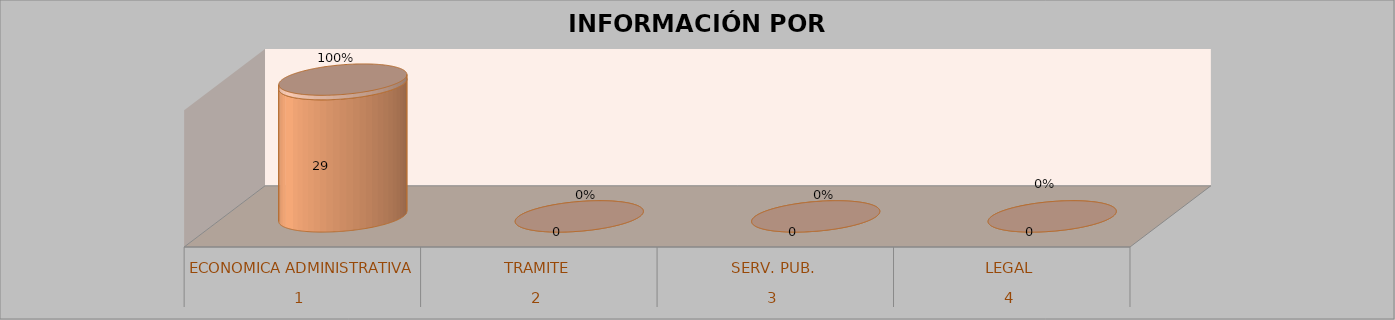
| Category | Series 0 | Series 1 | Series 2 | Series 3 |
|---|---|---|---|---|
| 0 |  |  | 29 | 1 |
| 1 |  |  | 0 | 0 |
| 2 |  |  | 0 | 0 |
| 3 |  |  | 0 | 0 |